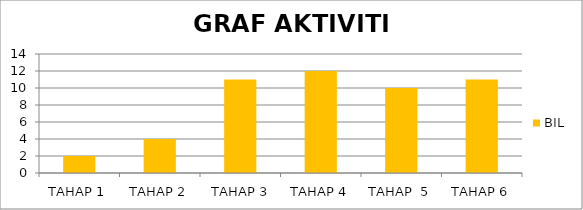
| Category | BIL |
|---|---|
| TAHAP 1 | 2 |
| TAHAP 2 | 4 |
|  TAHAP 3 | 11 |
| TAHAP 4 | 12 |
| TAHAP  5 | 10 |
| TAHAP 6 | 11 |